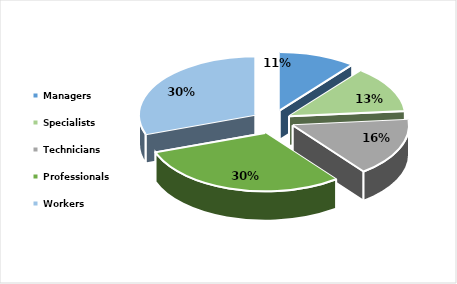
| Category | Series 0 |
|---|---|
| Managers | 0.107 |
| Specialists | 0.128 |
| Technicians | 0.16 |
| Professionals | 0.3 |
| Workers  | 0.304 |